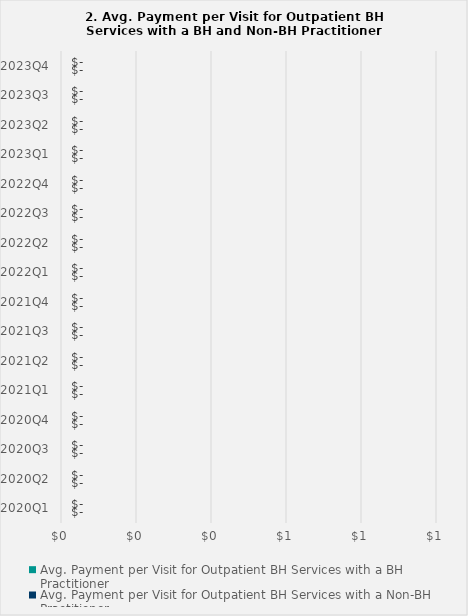
| Category | Avg. Payment per Visit for Outpatient BH Services with a BH Practitioner | Avg. Payment per Visit for Outpatient BH Services with a Non-BH Practitioner |
|---|---|---|
| 2020Q1 | 0 | 0 |
| 2020Q2 | 0 | 0 |
| 2020Q3 | 0 | 0 |
| 2020Q4 | 0 | 0 |
| 2021Q1 | 0 | 0 |
| 2021Q2 | 0 | 0 |
| 2021Q3 | 0 | 0 |
| 2021Q4 | 0 | 0 |
| 2022Q1 | 0 | 0 |
| 2022Q2 | 0 | 0 |
| 2022Q3 | 0 | 0 |
| 2022Q4 | 0 | 0 |
| 2023Q1 | 0 | 0 |
| 2023Q2 | 0 | 0 |
| 2023Q3 | 0 | 0 |
| 2023Q4 | 0 | 0 |